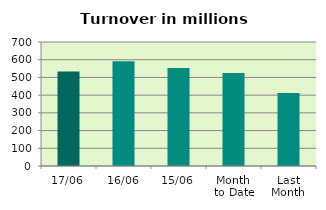
| Category | Series 0 |
|---|---|
| 17/06 | 532.993 |
| 16/06 | 591.302 |
| 15/06 | 552.652 |
| Month 
to Date | 524.821 |
| Last
Month | 412.236 |